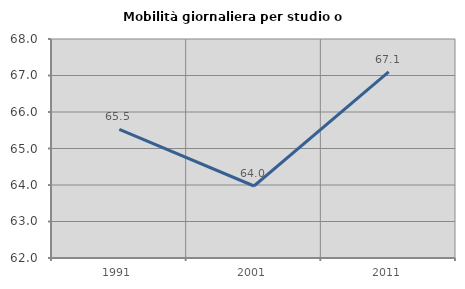
| Category | Mobilità giornaliera per studio o lavoro |
|---|---|
| 1991.0 | 65.521 |
| 2001.0 | 63.973 |
| 2011.0 | 67.1 |